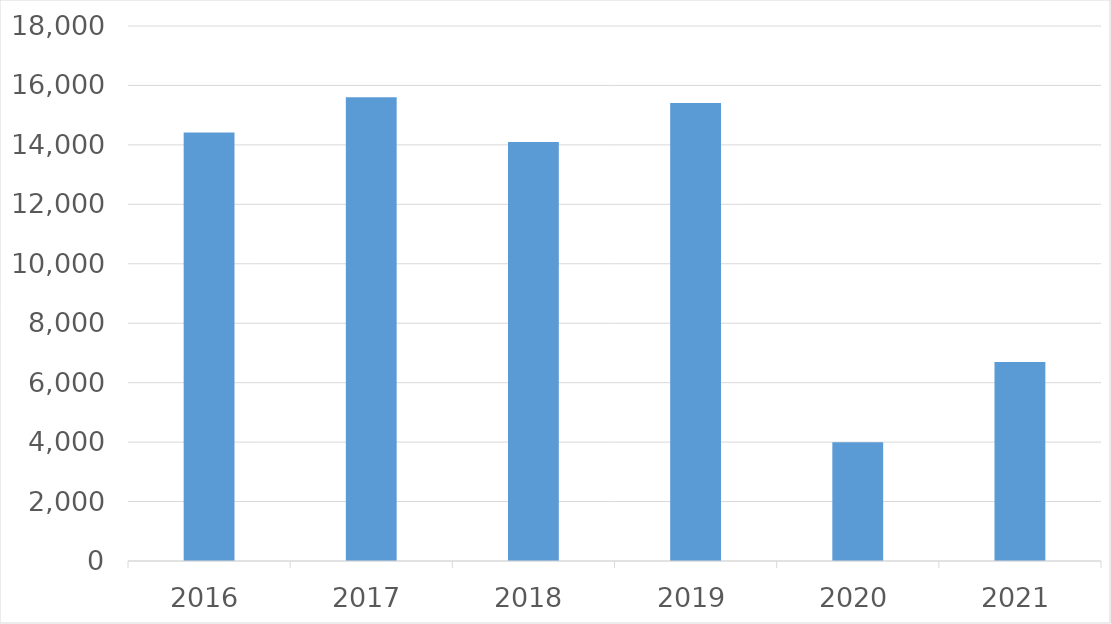
| Category | Series 0 |
|---|---|
| 2016 | 14417 |
| 2017 | 15601 |
| 2018 | 14100 |
| 2019 | 15411 |
| 2020 | 3994 |
| 2021 | 6693 |